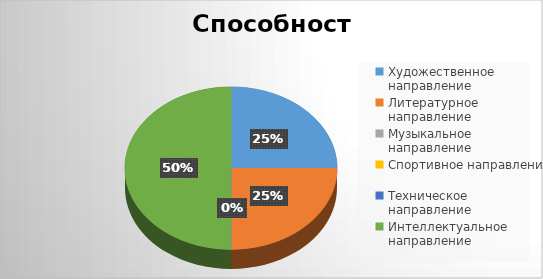
| Category | Series 0 |
|---|---|
| Художественное направление | 1 |
| Литературное направление | 1 |
| Музыкальное направление | 0 |
| Спортивное направление | 0 |
| Техническое направление | 0 |
| Интеллектуальное направление | 2 |